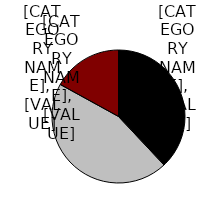
| Category | Series 0 |
|---|---|
| Other | 0.38 |
| Teachers | 0.45 |
| Public safety | 0.17 |